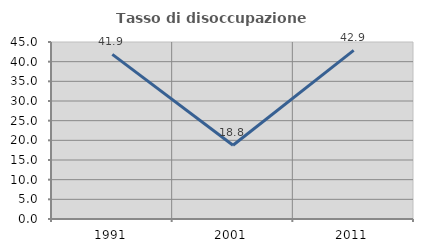
| Category | Tasso di disoccupazione giovanile  |
|---|---|
| 1991.0 | 41.86 |
| 2001.0 | 18.75 |
| 2011.0 | 42.857 |